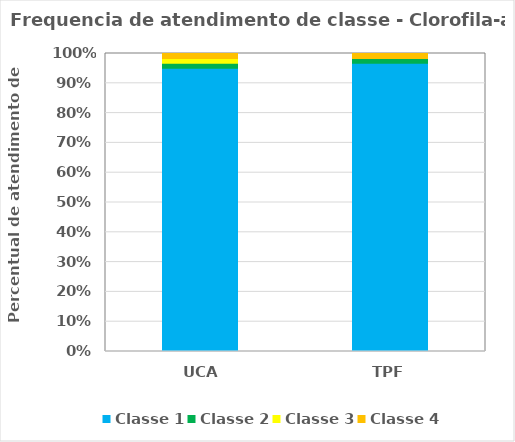
| Category | Classe 1 | Classe 2 | Classe 3 | Classe 4 |
|---|---|---|---|---|
| UCA | 0.951 | 0.016 | 0.016 | 0.016 |
| TPF | 0.967 | 0.016 | 0 | 0.016 |